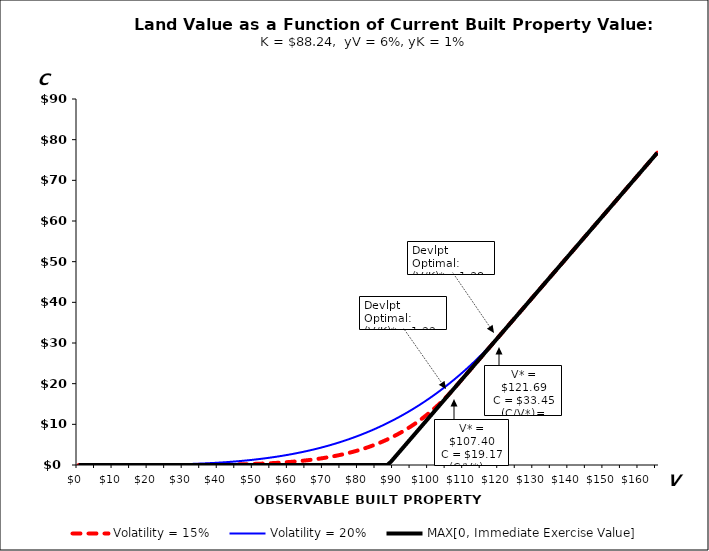
| Category | Volatility = 15% | Volatility = 20% | MAX[0, Immediate Exercise Value] |
|---|---|---|---|
| 0.0 | 0 | 0 | 0 |
| 1.0 | 0 | 0 | 0 |
| 2.0 | 0 | 0 | 0 |
| 3.0 | 0 | 0 | 0 |
| 4.0 | 0 | 0 | 0 |
| 5.0 | 0 | 0 | 0 |
| 6.0 | 0 | 0.001 | 0 |
| 7.0 | 0 | 0.001 | 0 |
| 8.0 | 0 | 0.002 | 0 |
| 9.0 | 0 | 0.003 | 0 |
| 10.0 | 0 | 0.004 | 0 |
| 11.0 | 0 | 0.005 | 0 |
| 12.0 | 0 | 0.007 | 0 |
| 13.0 | 0 | 0.01 | 0 |
| 14.0 | 0 | 0.013 | 0 |
| 15.0 | 0 | 0.016 | 0 |
| 16.0 | 0 | 0.021 | 0 |
| 17.0 | 0.001 | 0.026 | 0 |
| 18.0 | 0.001 | 0.032 | 0 |
| 19.0 | 0.001 | 0.039 | 0 |
| 20.0 | 0.002 | 0.047 | 0 |
| 21.0 | 0.002 | 0.056 | 0 |
| 22.0 | 0.003 | 0.066 | 0 |
| 23.0 | 0.003 | 0.078 | 0 |
| 24.0 | 0.004 | 0.091 | 0 |
| 25.0 | 0.005 | 0.106 | 0 |
| 26.0 | 0.007 | 0.122 | 0 |
| 27.0 | 0.008 | 0.14 | 0 |
| 28.0 | 0.01 | 0.16 | 0 |
| 29.0 | 0.012 | 0.181 | 0 |
| 30.0 | 0.015 | 0.205 | 0 |
| 31.0 | 0.018 | 0.231 | 0 |
| 32.0 | 0.022 | 0.26 | 0 |
| 33.0 | 0.026 | 0.29 | 0 |
| 34.0 | 0.03 | 0.324 | 0 |
| 35.0 | 0.036 | 0.36 | 0 |
| 36.0 | 0.042 | 0.398 | 0 |
| 37.0 | 0.049 | 0.44 | 0 |
| 38.0 | 0.057 | 0.485 | 0 |
| 39.0 | 0.066 | 0.533 | 0 |
| 40.0 | 0.076 | 0.585 | 0 |
| 41.0 | 0.087 | 0.64 | 0 |
| 42.0 | 0.099 | 0.698 | 0 |
| 43.0 | 0.114 | 0.761 | 0 |
| 44.0 | 0.129 | 0.827 | 0 |
| 45.0 | 0.146 | 0.897 | 0 |
| 46.0 | 0.166 | 0.972 | 0 |
| 47.0 | 0.187 | 1.051 | 0 |
| 48.0 | 0.21 | 1.135 | 0 |
| 49.0 | 0.236 | 1.223 | 0 |
| 50.0 | 0.264 | 1.316 | 0 |
| 51.0 | 0.295 | 1.415 | 0 |
| 52.0 | 0.329 | 1.518 | 0 |
| 53.0 | 0.366 | 1.627 | 0 |
| 54.0 | 0.407 | 1.742 | 0 |
| 55.0 | 0.451 | 1.862 | 0 |
| 56.0 | 0.499 | 1.988 | 0 |
| 57.0 | 0.551 | 2.12 | 0 |
| 58.0 | 0.607 | 2.259 | 0 |
| 59.0 | 0.668 | 2.403 | 0 |
| 60.0 | 0.734 | 2.555 | 0 |
| 61.0 | 0.805 | 2.713 | 0 |
| 62.0 | 0.882 | 2.879 | 0 |
| 63.0 | 0.965 | 3.051 | 0 |
| 64.0 | 1.054 | 3.231 | 0 |
| 65.0 | 1.15 | 3.418 | 0 |
| 66.0 | 1.252 | 3.614 | 0 |
| 67.0 | 1.362 | 3.817 | 0 |
| 68.0 | 1.48 | 4.028 | 0 |
| 69.0 | 1.606 | 4.248 | 0 |
| 70.0 | 1.741 | 4.476 | 0 |
| 71.0 | 1.885 | 4.713 | 0 |
| 72.0 | 2.039 | 4.959 | 0 |
| 73.0 | 2.203 | 5.214 | 0 |
| 74.0 | 2.377 | 5.479 | 0 |
| 75.0 | 2.563 | 5.753 | 0 |
| 76.0 | 2.76 | 6.037 | 0 |
| 77.0 | 2.97 | 6.331 | 0 |
| 78.0 | 3.193 | 6.635 | 0 |
| 79.0 | 3.429 | 6.95 | 0 |
| 80.0 | 3.679 | 7.275 | 0 |
| 81.0 | 3.945 | 7.611 | 0 |
| 82.0 | 4.225 | 7.959 | 0 |
| 83.0 | 4.522 | 8.318 | 0 |
| 84.0 | 4.836 | 8.688 | 0 |
| 85.0 | 5.168 | 9.07 | 0 |
| 86.0 | 5.518 | 9.464 | 0 |
| 87.0 | 5.887 | 9.871 | 0 |
| 88.0 | 6.276 | 10.29 | 0 |
| 89.0 | 6.687 | 10.721 | 0.765 |
| 90.0 | 7.119 | 11.166 | 1.765 |
| 91.0 | 7.573 | 11.624 | 2.765 |
| 92.0 | 8.052 | 12.096 | 3.765 |
| 93.0 | 8.554 | 12.581 | 4.765 |
| 94.0 | 9.083 | 13.08 | 5.765 |
| 95.0 | 9.638 | 13.593 | 6.765 |
| 96.0 | 10.22 | 14.121 | 7.765 |
| 97.0 | 10.831 | 14.663 | 8.765 |
| 98.0 | 11.472 | 15.221 | 9.765 |
| 99.0 | 12.143 | 15.793 | 10.765 |
| 100.0 | 12.846 | 16.381 | 11.765 |
| 101.0 | 13.583 | 16.985 | 12.765 |
| 102.0 | 14.354 | 17.605 | 13.765 |
| 103.0 | 15.16 | 18.241 | 14.765 |
| 104.0 | 16.004 | 18.893 | 15.765 |
| 105.0 | 16.885 | 19.562 | 16.765 |
| 106.0 | 17.806 | 20.249 | 17.765 |
| 107.0 | 18.768 | 20.952 | 18.765 |
| 108.0 | 19.765 | 21.673 | 19.765 |
| 109.0 | 20.765 | 22.412 | 20.765 |
| 110.0 | 21.765 | 23.169 | 21.765 |
| 111.0 | 22.765 | 23.945 | 22.765 |
| 112.0 | 23.765 | 24.739 | 23.765 |
| 113.0 | 24.765 | 25.552 | 24.765 |
| 114.0 | 25.765 | 26.384 | 25.765 |
| 115.0 | 26.765 | 27.235 | 26.765 |
| 116.0 | 27.765 | 28.107 | 27.765 |
| 117.0 | 28.765 | 28.998 | 28.765 |
| 118.0 | 29.765 | 29.91 | 29.765 |
| 119.0 | 30.765 | 30.842 | 30.765 |
| 120.0 | 31.765 | 31.795 | 31.765 |
| 121.0 | 32.765 | 32.77 | 32.765 |
| 122.0 | 33.765 | 33.765 | 33.765 |
| 123.0 | 34.765 | 34.765 | 34.765 |
| 124.0 | 35.765 | 35.765 | 35.765 |
| 125.0 | 36.765 | 36.765 | 36.765 |
| 126.0 | 37.765 | 37.765 | 37.765 |
| 127.0 | 38.765 | 38.765 | 38.765 |
| 128.0 | 39.765 | 39.765 | 39.765 |
| 129.0 | 40.765 | 40.765 | 40.765 |
| 130.0 | 41.765 | 41.765 | 41.765 |
| 131.0 | 42.765 | 42.765 | 42.765 |
| 132.0 | 43.765 | 43.765 | 43.765 |
| 133.0 | 44.765 | 44.765 | 44.765 |
| 134.0 | 45.765 | 45.765 | 45.765 |
| 135.0 | 46.765 | 46.765 | 46.765 |
| 136.0 | 47.765 | 47.765 | 47.765 |
| 137.0 | 48.765 | 48.765 | 48.765 |
| 138.0 | 49.765 | 49.765 | 49.765 |
| 139.0 | 50.765 | 50.765 | 50.765 |
| 140.0 | 51.765 | 51.765 | 51.765 |
| 141.0 | 52.765 | 52.765 | 52.765 |
| 142.0 | 53.765 | 53.765 | 53.765 |
| 143.0 | 54.765 | 54.765 | 54.765 |
| 144.0 | 55.765 | 55.765 | 55.765 |
| 145.0 | 56.765 | 56.765 | 56.765 |
| 146.0 | 57.765 | 57.765 | 57.765 |
| 147.0 | 58.765 | 58.765 | 58.765 |
| 148.0 | 59.765 | 59.765 | 59.765 |
| 149.0 | 60.765 | 60.765 | 60.765 |
| 150.0 | 61.765 | 61.765 | 61.765 |
| 151.0 | 62.765 | 62.765 | 62.765 |
| 152.0 | 63.765 | 63.765 | 63.765 |
| 153.0 | 64.765 | 64.765 | 64.765 |
| 154.0 | 65.765 | 65.765 | 65.765 |
| 155.0 | 66.765 | 66.765 | 66.765 |
| 156.0 | 67.765 | 67.765 | 67.765 |
| 157.0 | 68.765 | 68.765 | 68.765 |
| 158.0 | 69.765 | 69.765 | 69.765 |
| 159.0 | 70.765 | 70.765 | 70.765 |
| 160.0 | 71.765 | 71.765 | 71.765 |
| 161.0 | 72.765 | 72.765 | 72.765 |
| 162.0 | 73.765 | 73.765 | 73.765 |
| 163.0 | 74.765 | 74.765 | 74.765 |
| 164.0 | 75.765 | 75.765 | 75.765 |
| 165.0 | 76.765 | 76.765 | 76.765 |